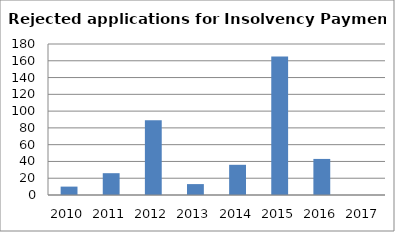
| Category | Series 0 |
|---|---|
| 2010.0 | 10 |
| 2011.0 | 26 |
| 2012.0 | 89 |
| 2013.0 | 13 |
| 2014.0 | 36 |
| 2015.0 | 165 |
| 2016.0 | 43 |
| 2017.0 | 0 |